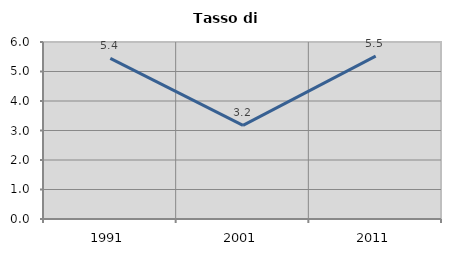
| Category | Tasso di disoccupazione   |
|---|---|
| 1991.0 | 5.444 |
| 2001.0 | 3.176 |
| 2011.0 | 5.524 |